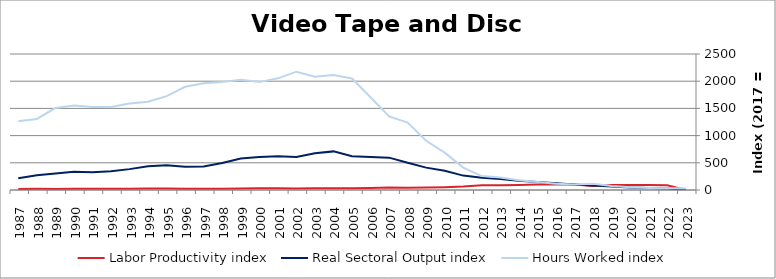
| Category | Labor Productivity index | Real Sectoral Output index | Hours Worked index |
|---|---|---|---|
| 2023.0 | 0 | 0 | 33.286 |
| 2022.0 | 85.256 | 27.712 | 32.504 |
| 2021.0 | 90.738 | 35.055 | 38.633 |
| 2020.0 | 90.727 | 46.805 | 51.589 |
| 2019.0 | 90.779 | 66.515 | 73.272 |
| 2018.0 | 72.654 | 84.702 | 116.583 |
| 2017.0 | 100 | 100 | 100 |
| 2016.0 | 107.096 | 122.214 | 114.117 |
| 2015.0 | 101.379 | 147.825 | 145.814 |
| 2014.0 | 93.965 | 169.999 | 180.918 |
| 2013.0 | 87.319 | 200.422 | 229.529 |
| 2012.0 | 88.083 | 225.067 | 255.517 |
| 2011.0 | 64.373 | 264.535 | 410.943 |
| 2010.0 | 51.663 | 354.484 | 686.154 |
| 2009.0 | 45.435 | 411.552 | 905.802 |
| 2008.0 | 40.504 | 502.072 | 1239.574 |
| 2007.0 | 44.001 | 594.622 | 1351.392 |
| 2006.0 | 35.61 | 606.784 | 1703.956 |
| 2005.0 | 30.209 | 619.318 | 2050.114 |
| 2004.0 | 33.595 | 709.851 | 2112.977 |
| 2003.0 | 32.51 | 677.166 | 2082.969 |
| 2002.0 | 27.876 | 606.326 | 2175.061 |
| 2001.0 | 30.129 | 618.452 | 2052.701 |
| 2000.0 | 30.58 | 606.489 | 1983.275 |
| 1999.0 | 28.561 | 579.067 | 2027.49 |
| 1998.0 | 24.913 | 494.882 | 1986.47 |
| 1997.0 | 22.007 | 431.601 | 1961.208 |
| 1996.0 | 22.471 | 426.408 | 1897.618 |
| 1995.0 | 26.385 | 455.136 | 1725.007 |
| 1994.0 | 26.872 | 436.061 | 1622.732 |
| 1993.0 | 24.138 | 383.734 | 1589.727 |
| 1992.0 | 22.561 | 344.683 | 1527.815 |
| 1991.0 | 21.208 | 324.06 | 1528.013 |
| 1990.0 | 21.556 | 334.666 | 1552.526 |
| 1989.0 | 20.163 | 303.638 | 1505.905 |
| 1988.0 | 20.74 | 270.928 | 1306.325 |
| 1987.0 | 17.032 | 214.893 | 1261.702 |